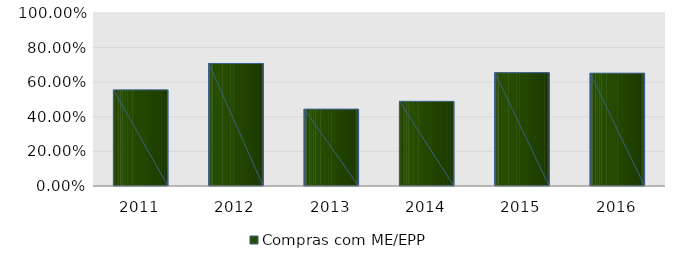
| Category | Compras com ME/EPP |
|---|---|
| 2011.0 | 0.556 |
| 2012.0 | 0.708 |
| 2013.0 | 0.444 |
| 2014.0 | 0.489 |
| 2015.0 | 0.655 |
| 2016.0 | 0.652 |